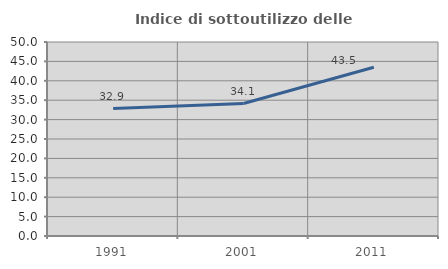
| Category | Indice di sottoutilizzo delle abitazioni  |
|---|---|
| 1991.0 | 32.857 |
| 2001.0 | 34.146 |
| 2011.0 | 43.503 |